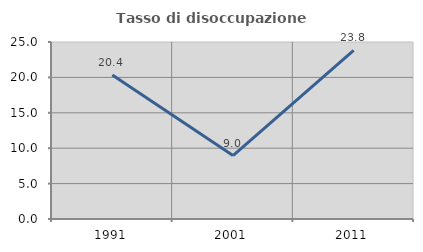
| Category | Tasso di disoccupazione giovanile  |
|---|---|
| 1991.0 | 20.354 |
| 2001.0 | 8.955 |
| 2011.0 | 23.81 |